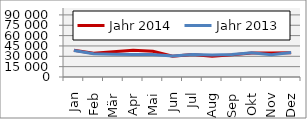
| Category | Jahr 2014 | Jahr 2013 |
|---|---|---|
| Jan | 38746.605 | 38266.867 |
| Feb | 34337.164 | 33666.261 |
| Mär | 36552.565 | 33070.877 |
| Apr | 38931.633 | 32729.111 |
| Mai | 37363.049 | 32511.097 |
| Jun | 30036.817 | 30323.283 |
| Jul | 32744.968 | 32519.173 |
| Aug | 29971.789 | 31812.97 |
| Sep | 32064.749 | 32450.592 |
| Okt | 34775.824 | 35228.06 |
| Nov | 34835.203 | 32205.986 |
| Dez | 35319.714 | 35502.727 |